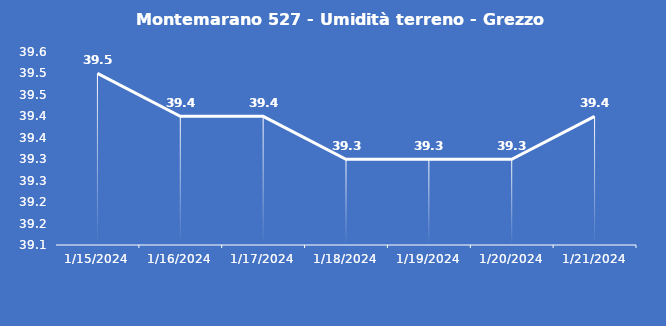
| Category | Montemarano 527 - Umidità terreno - Grezzo (%VWC) |
|---|---|
| 1/15/24 | 39.5 |
| 1/16/24 | 39.4 |
| 1/17/24 | 39.4 |
| 1/18/24 | 39.3 |
| 1/19/24 | 39.3 |
| 1/20/24 | 39.3 |
| 1/21/24 | 39.4 |